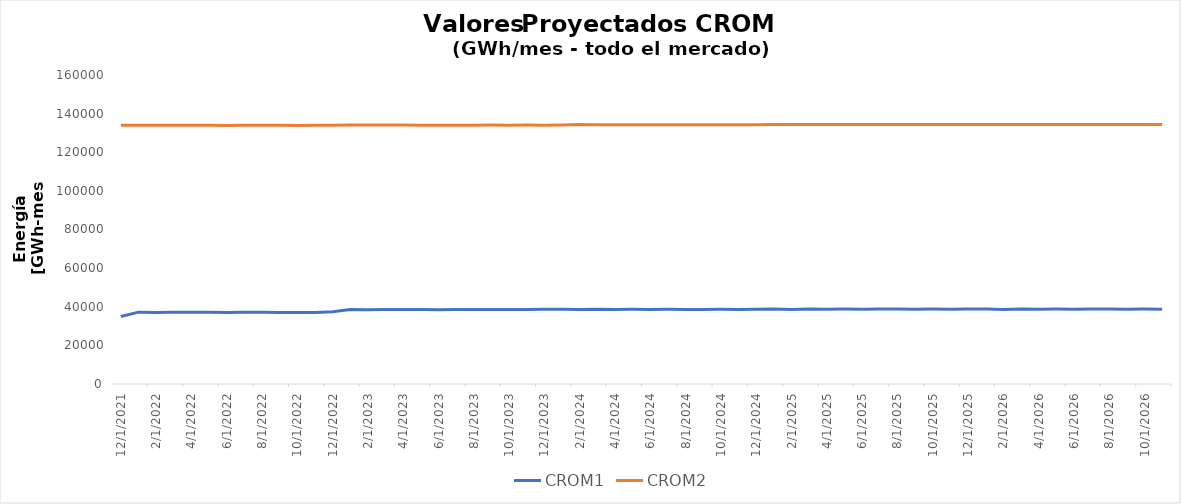
| Category | CROM1 | CROM2 |
|---|---|---|
| 12/1/21 | 34989.446 | 133971.398 |
| 1/1/22 | 37195.498 | 134001.717 |
| 2/1/22 | 37069.176 | 134013.262 |
| 3/1/22 | 37201.8 | 133997.778 |
| 4/1/22 | 37154.319 | 133937.238 |
| 5/1/22 | 37158.362 | 133925.627 |
| 6/1/22 | 37063.338 | 133899.738 |
| 7/1/22 | 37090.475 | 133971.151 |
| 8/1/22 | 37094.262 | 133954.554 |
| 9/1/22 | 37032.584 | 133981.344 |
| 10/1/22 | 37074.13 | 133892.835 |
| 11/1/22 | 37034.52 | 133952.027 |
| 12/1/22 | 37461.43 | 133982.718 |
| 1/1/23 | 38630.055 | 134063.757 |
| 2/1/23 | 38386.565 | 134150.553 |
| 3/1/23 | 38636.701 | 134063.574 |
| 4/1/23 | 38542.458 | 134073.117 |
| 5/1/23 | 38623.151 | 134018.319 |
| 6/1/23 | 38510.88 | 134026.128 |
| 7/1/23 | 38591.327 | 134016.997 |
| 8/1/23 | 38606.168 | 134016.944 |
| 9/1/23 | 38534.347 | 134089.637 |
| 10/1/23 | 38611.397 | 134018.139 |
| 11/1/23 | 38525.15 | 134089.796 |
| 12/1/23 | 38649.654 | 134016.241 |
| 1/1/24 | 38672.072 | 134129.495 |
| 2/1/24 | 38514.946 | 134337.792 |
| 3/1/24 | 38681.221 | 134208.025 |
| 4/1/24 | 38588.684 | 134257.857 |
| 5/1/24 | 38666.899 | 134207.011 |
| 6/1/24 | 38557.13 | 134257.857 |
| 7/1/24 | 38644.929 | 134207.389 |
| 8/1/24 | 38636.414 | 134207.306 |
| 9/1/24 | 38561.825 | 134210.634 |
| 10/1/24 | 38642.755 | 134206.605 |
| 11/1/24 | 38557.861 | 134210.513 |
| 12/1/24 | 38669.254 | 134207.476 |
| 1/1/25 | 38795.016 | 134339.588 |
| 2/1/25 | 38533.033 | 134338.88 |
| 3/1/25 | 38789.604 | 134339.588 |
| 4/1/25 | 38695.938 | 134339.34 |
| 5/1/25 | 38790.673 | 134339.588 |
| 6/1/25 | 38695.163 | 134339.34 |
| 7/1/25 | 38789.343 | 134339.588 |
| 8/1/25 | 38791.831 | 134339.588 |
| 9/1/25 | 38695.426 | 134339.361 |
| 10/1/25 | 38792.017 | 134339.61 |
| 11/1/25 | 38695.466 | 134339.36 |
| 12/1/25 | 38790.172 | 134339.608 |
| 1/1/26 | 38807.88 | 134341.667 |
| 2/1/26 | 38542.61 | 134341.201 |
| 3/1/26 | 38801.68 | 134341.667 |
| 4/1/26 | 38702.841 | 134341.508 |
| 5/1/26 | 38795.198 | 134341.667 |
| 6/1/26 | 38700.142 | 134341.508 |
| 7/1/26 | 38794.697 | 134341.667 |
| 8/1/26 | 38794.154 | 134341.667 |
| 9/1/26 | 38706.79 | 134341.508 |
| 10/1/26 | 38791.05 | 134341.667 |
| 11/1/26 | 38696.425 | 134341.508 |